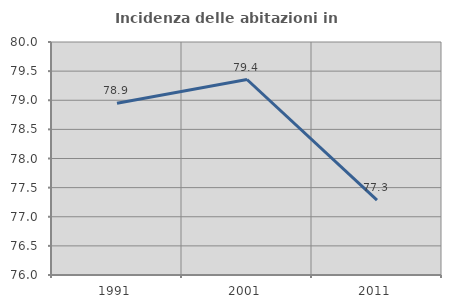
| Category | Incidenza delle abitazioni in proprietà  |
|---|---|
| 1991.0 | 78.949 |
| 2001.0 | 79.356 |
| 2011.0 | 77.286 |